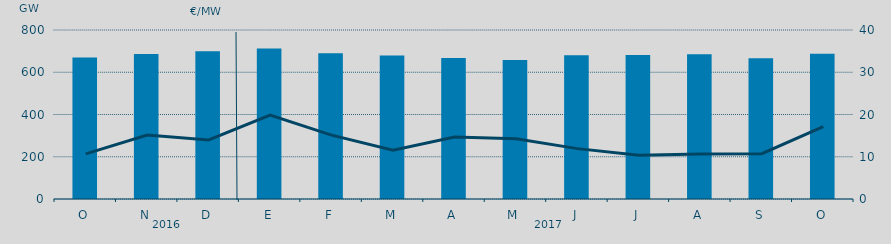
| Category | Energia (MWh) a subir |
|---|---|
| O | 669.591 |
| N | 686.044 |
| D | 698.836 |
| E | 712.52 |
| F | 690.067 |
| M | 679.79 |
| A | 667.793 |
| M | 657.634 |
| J | 680.754 |
| J | 681.722 |
| A | 685.083 |
| S | 666.501 |
| O | 686.996 |